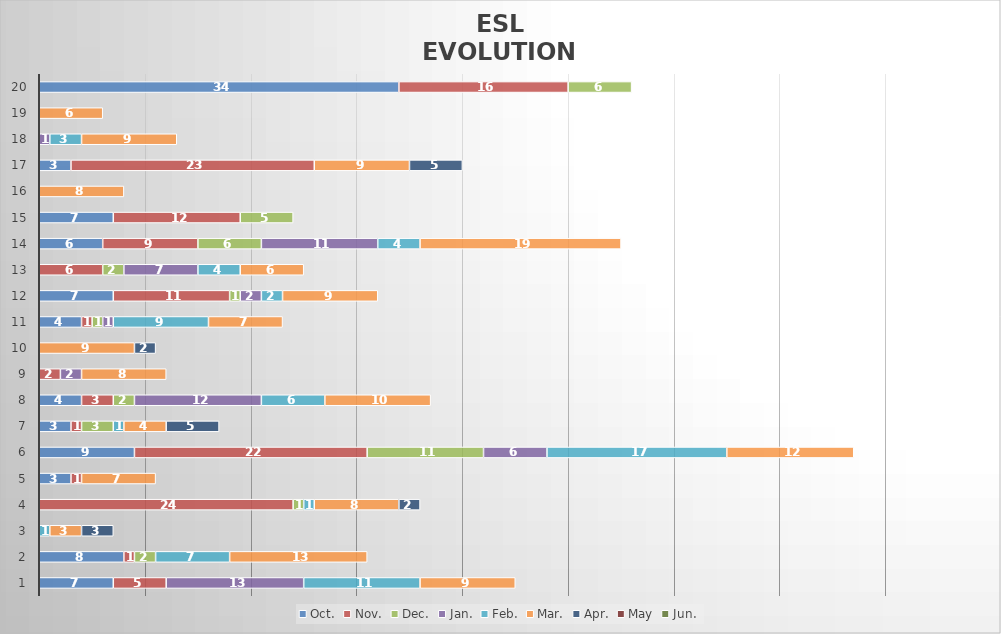
| Category | Oct. | Nov. | Dec. | Jan. | Feb. | Mar. | Apr. | May | Jun. |
|---|---|---|---|---|---|---|---|---|---|
| 1.0 | 7 | 5 | 0 | 13 | 11 | 9 | 0 | 0 | 0 |
| 2.0 | 8 | 1 | 2 | 0 | 7 | 13 | 0 | 0 | 0 |
| 3.0 | 0 | 0 | 0 | 0 | 1 | 3 | 3 | 0 | 0 |
| 4.0 | 0 | 24 | 1 | 0 | 1 | 8 | 2 | 0 | 0 |
| 5.0 | 3 | 1 | 0 | 0 | 0 | 7 | 0 | 0 | 0 |
| 6.0 | 9 | 22 | 11 | 6 | 17 | 12 | 0 | 0 | 0 |
| 7.0 | 3 | 1 | 3 | 0 | 1 | 4 | 5 | 0 | 0 |
| 8.0 | 4 | 3 | 2 | 12 | 6 | 10 | 0 | 0 | 0 |
| 9.0 | 0 | 2 | 0 | 2 | 0 | 8 | 0 | 0 | 0 |
| 10.0 | 0 | 0 | 0 | 0 | 0 | 9 | 2 | 0 | 0 |
| 11.0 | 4 | 1 | 1 | 1 | 9 | 7 | 0 | 0 | 0 |
| 12.0 | 7 | 11 | 1 | 2 | 2 | 9 | 0 | 0 | 0 |
| 13.0 | 0 | 6 | 2 | 7 | 4 | 6 | 0 | 0 | 0 |
| 14.0 | 6 | 9 | 6 | 11 | 4 | 19 | 0 | 0 | 0 |
| 15.0 | 7 | 12 | 5 | 0 | 0 | 0 | 0 | 0 | 0 |
| 16.0 | 0 | 0 | 0 | 0 | 0 | 8 | 0 | 0 | 0 |
| 17.0 | 3 | 23 | 0 | 0 | 0 | 9 | 5 | 0 | 0 |
| 18.0 | 0 | 0 | 0 | 1 | 3 | 9 | 0 | 0 | 0 |
| 19.0 | 0 | 0 | 0 | 0 | 0 | 6 | 0 | 0 | 0 |
| 20.0 | 34 | 16 | 6 | 0 | 0 | 0 | 0 | 0 | 0 |